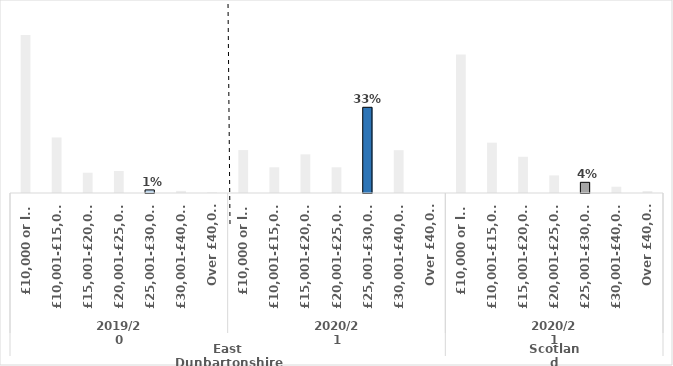
| Category | Series 0 |
|---|---|
| 0 | 0.604 |
| 1 | 0.212 |
| 2 | 0.077 |
| 3 | 0.084 |
| 4 | 0.012 |
| 5 | 0.008 |
| 6 | 0.002 |
| 7 | 0.164 |
| 8 | 0.098 |
| 9 | 0.148 |
| 10 | 0.098 |
| 11 | 0.328 |
| 12 | 0.164 |
| 13 | 0 |
| 14 | 0.53 |
| 15 | 0.192 |
| 16 | 0.139 |
| 17 | 0.067 |
| 18 | 0.041 |
| 19 | 0.024 |
| 20 | 0.007 |